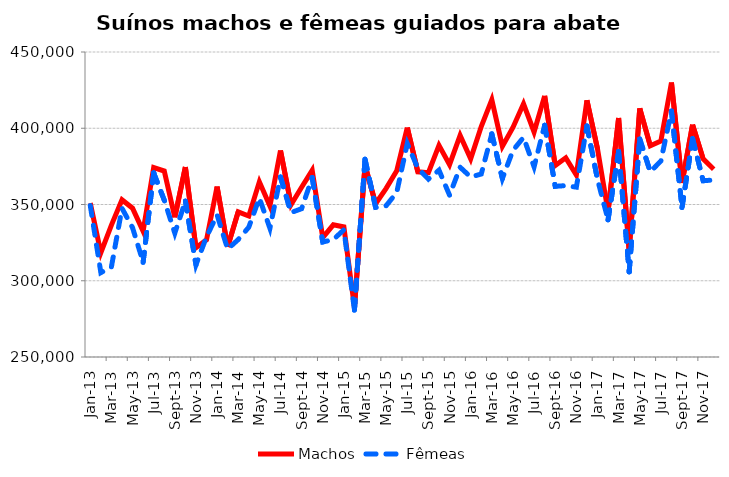
| Category | Machos | Fêmeas |
|---|---|---|
| 2013-01-01 | 350912 | 349306 |
| 2013-02-01 | 318425 | 305318 |
| 2013-03-01 | 336486 | 309120 |
| 2013-04-01 | 353143 | 347533 |
| 2013-05-01 | 347578 | 334798 |
| 2013-06-01 | 332482 | 312120 |
| 2013-07-01 | 374216 | 370692 |
| 2013-08-01 | 371933 | 352857 |
| 2013-09-01 | 341568 | 331213 |
| 2013-10-01 | 374499 | 352240 |
| 2013-11-01 | 321624 | 310429 |
| 2013-12-01 | 326805 | 328821 |
| 2014-01-01 | 361748 | 343172 |
| 2014-02-01 | 322229 | 320745 |
| 2014-03-01 | 345197 | 327010 |
| 2014-04-01 | 342481 | 335116 |
| 2014-05-01 | 364844 | 354229 |
| 2014-06-01 | 348946 | 334417 |
| 2014-07-01 | 385381 | 367971 |
| 2014-08-01 | 349836 | 344709 |
| 2014-09-01 | 361266 | 347250 |
| 2014-10-01 | 372396 | 367609 |
| 2014-11-01 | 328296 | 325419 |
| 2014-12-01 | 336698 | 326998 |
| 2015-01-01 | 335279 | 333415 |
| 2015-02-01 | 282476 | 280742 |
| 2015-03-01 | 375857 | 379734 |
| 2015-04-01 | 350486 | 348121 |
| 2015-05-01 | 360626 | 349213 |
| 2015-06-01 | 372041 | 357872 |
| 2015-07-01 | 400400 | 389963 |
| 2015-08-01 | 371417 | 373764 |
| 2015-09-01 | 370841 | 366646 |
| 2015-10-01 | 388755 | 372521 |
| 2015-11-01 | 376107 | 356099 |
| 2015-12-01 | 395339 | 374431 |
| 2016-01-01 | 379994 | 368002 |
| 2016-02-01 | 401098 | 370001 |
| 2016-03-01 | 418769 | 396271 |
| 2016-04-01 | 388098 | 367046 |
| 2016-05-01 | 400548 | 385494 |
| 2016-06-01 | 416020 | 394014 |
| 2016-07-01 | 397552 | 374708 |
| 2016-08-01 | 421228 | 401937 |
| 2016-09-01 | 375514 | 361916 |
| 2016-10-01 | 380594 | 362387 |
| 2016-11-01 | 369310 | 361376 |
| 2016-12-01 | 418373 | 401463 |
| 2017-01-01 | 386524 | 366511 |
| 2017-02-01 | 345318 | 339926 |
| 2017-03-01 | 406721 | 384706 |
| 2017-04-01 | 319932 | 305864 |
| 2017-05-01 | 413067 | 392938 |
| 2017-06-01 | 388488 | 371384 |
| 2017-07-01 | 391652 | 378576 |
| 2017-08-01 | 429950 | 411237 |
| 2017-09-01 | 364118 | 348069 |
| 2017-10-01 | 402266 | 393115 |
| 2017-11-01 | 379920 | 365561 |
| 2017-12-01 | 373134 | 366094 |